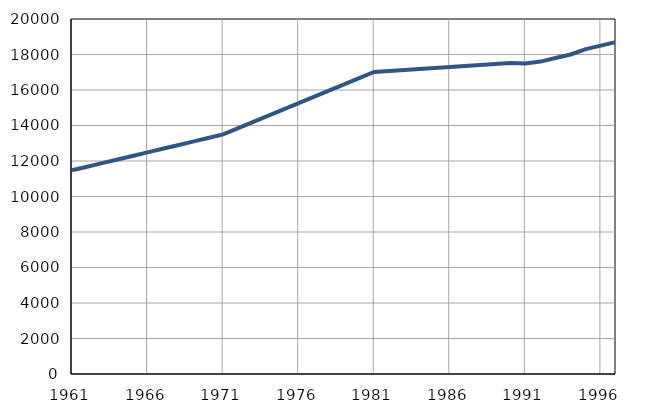
| Category | Број
становника |
|---|---|
| 1961.0 | 11477 |
| 1962.0 | 11679 |
| 1963.0 | 11881 |
| 1964.0 | 12083 |
| 1965.0 | 12285 |
| 1966.0 | 12487 |
| 1967.0 | 12689 |
| 1968.0 | 12891 |
| 1969.0 | 13093 |
| 1970.0 | 13295 |
| 1971.0 | 13497 |
| 1972.0 | 13849 |
| 1973.0 | 14201 |
| 1974.0 | 14553 |
| 1975.0 | 14905 |
| 1976.0 | 15257 |
| 1977.0 | 15609 |
| 1978.0 | 15961 |
| 1979.0 | 16313 |
| 1980.0 | 16665 |
| 1981.0 | 17018 |
| 1982.0 | 17074 |
| 1983.0 | 17130 |
| 1984.0 | 17186 |
| 1985.0 | 17242 |
| 1986.0 | 17298 |
| 1987.0 | 17354 |
| 1988.0 | 17410 |
| 1989.0 | 17466 |
| 1990.0 | 17522 |
| 1991.0 | 17500 |
| 1992.0 | 17600 |
| 1993.0 | 17800 |
| 1994.0 | 18000 |
| 1995.0 | 18300 |
| 1996.0 | 18500 |
| 1997.0 | 18700 |